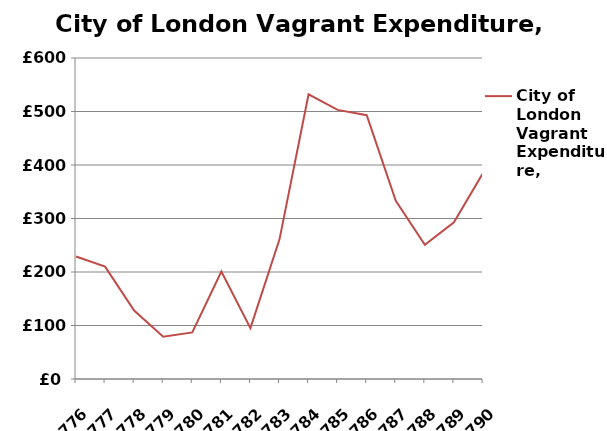
| Category | City of London Vagrant Expenditure, 1739-1792 |
|---|---|
| 1776 | 229 |
| 1777 | 210 |
| 1778 | 128 |
| 1779 | 79 |
| 1780 | 87 |
| 1781 | 201 |
| 1782 | 95 |
| 1783 | 261 |
| 1784 | 532 |
| 1785 | 503 |
| 1786 | 493 |
| 1787 | 333 |
| 1788 | 251 |
| 1789 | 293 |
| 1790 | 385 |